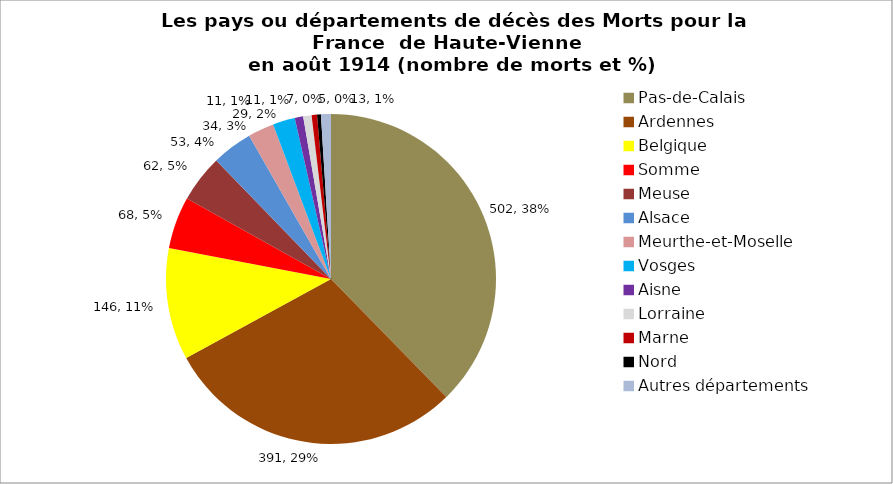
| Category | Les pays ou départements de décès des Morts pour la France  de Haute-Vienne en décembre 1914 |
|---|---|
| Pas-de-Calais | 502 |
| Ardennes | 391 |
| Belgique | 146 |
| Somme | 68 |
| Meuse | 62 |
| Alsace | 53 |
| Meurthe-et-Moselle | 34 |
| Vosges | 29 |
| Aisne | 11 |
| Lorraine  | 11 |
| Marne | 7 |
| Nord | 5 |
| Autres départements | 13 |